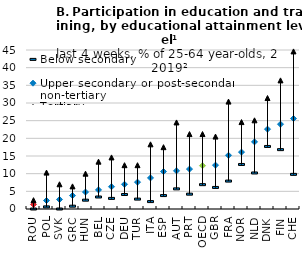
| Category | Below secondary | Upper secondary or post-secondary non-tertiary | Tertiary |
|---|---|---|---|
| ROU | 0 | 1.3 | 2.5 |
| POL | 0.6 | 2.4 | 10.3 |
| SVK | 0 | 2.7 | 7 |
| GRC | 0.8 | 3.8 | 6.4 |
| HUN | 2.5 | 4.8 | 10 |
| BEL | 3.4 | 5.4 | 13.4 |
| CZE | 3 | 6.3 | 14.6 |
| DEU | 4.1 | 7 | 12.4 |
| TUR | 2.8 | 7.6 | 12.4 |
| ITA | 2.1 | 8.8 | 18.3 |
| ESP | 3.8 | 10.6 | 17.5 |
| AUT | 5.7 | 10.8 | 24.5 |
| PRT | 4.2 | 11.3 | 21.2 |
| OECD | 6.89 | 12.25 | 21.21 |
| GBR | 6.1 | 12.4 | 20.5 |
| FRA | 7.9 | 15.2 | 30.4 |
| NOR | 12.6 | 16.1 | 24.6 |
| NLD | 10.2 | 19 | 25.1 |
| DNK | 17.7 | 22.6 | 31.4 |
| FIN | 16.8 | 24 | 36.4 |
| CHE | 9.8 | 25.6 | 44.6 |